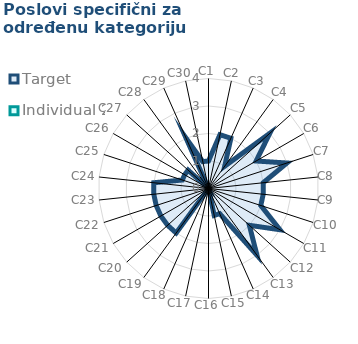
| Category | Target | Individual 2 |
|---|---|---|
| C1 | 1 | 0 |
| C2 | 2 | 0 |
| C3 | 2 | 0 |
| C4 | 1 | 0 |
| C5 | 3 | 0 |
| C6 | 2 | 0 |
| C7 | 3 | 0 |
| C8 | 2 | 0 |
| C9 | 2 | 0 |
| C10 | 2 | 0 |
| C11 | 3 | 0 |
| C12 | 2 | 0 |
| C13 | 3 | 0 |
| C14 | 1 | 0 |
| C15 | 1 | 0 |
| C16 | 0 | 0 |
| C17 | 0 | 0 |
| C18 | 0 | 0 |
| C19 | 2 | 0 |
| C20 | 2 | 0 |
| C21 | 2 | 0 |
| C22 | 2 | 0 |
| C23 | 2 | 0 |
| C24 | 2 | 0 |
| C25 | 1 | 0 |
| C26 | 1 | 0 |
| C27 | 1 | 0 |
| C28 | 0 | 0 |
| C29 | 2 | 0 |
| C30 | 1 | 0 |